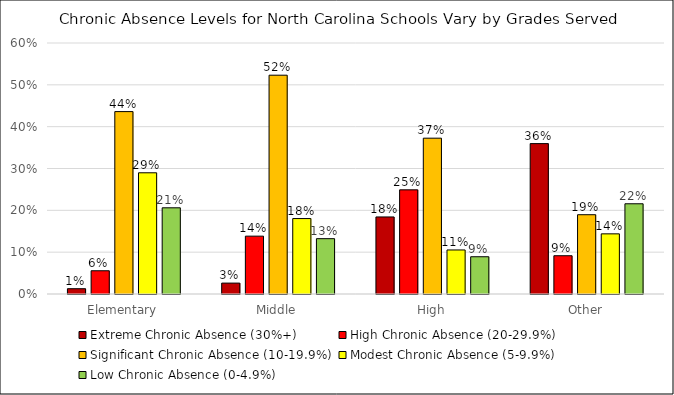
| Category | Extreme Chronic Absence (30%+) | High Chronic Absence (20-29.9%) | Significant Chronic Absence (10-19.9%) | Modest Chronic Absence (5-9.9%) | Low Chronic Absence (0-4.9%) |
|---|---|---|---|---|---|
| Elementary | 0.013 | 0.056 | 0.436 | 0.29 | 0.206 |
| Middle | 0.026 | 0.138 | 0.523 | 0.18 | 0.132 |
| High | 0.184 | 0.249 | 0.372 | 0.105 | 0.089 |
| Other | 0.359 | 0.092 | 0.19 | 0.144 | 0.216 |